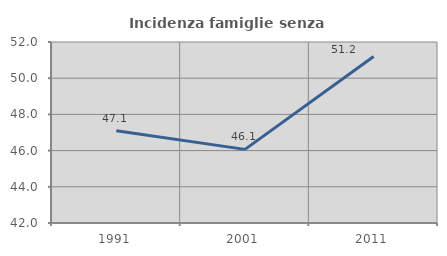
| Category | Incidenza famiglie senza nuclei |
|---|---|
| 1991.0 | 47.095 |
| 2001.0 | 46.067 |
| 2011.0 | 51.2 |